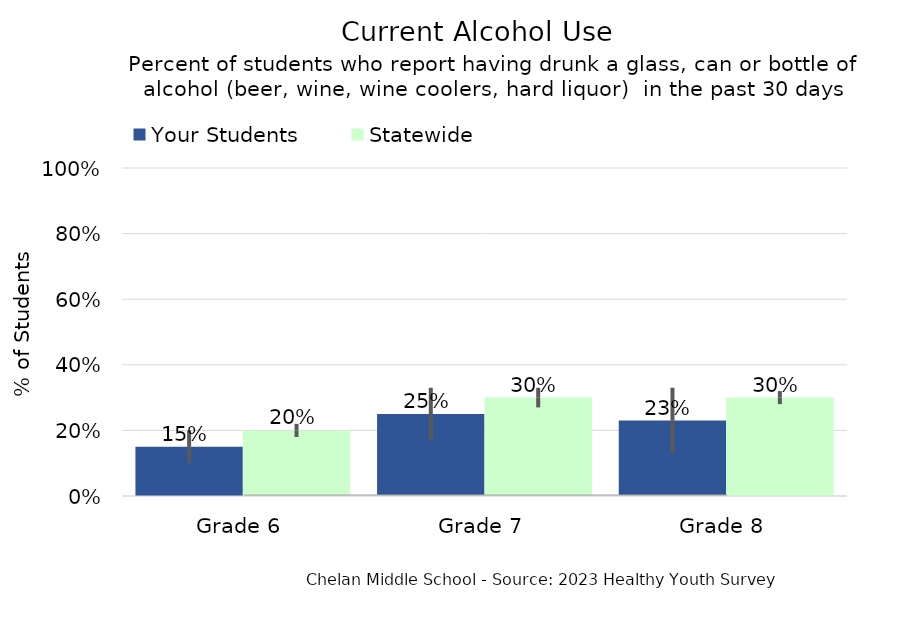
| Category | Your Students | Statewide |
|---|---|---|
| Grade 6 | 0.15 | 0.2 |
| Grade 7 | 0.25 | 0.3 |
| Grade 8 | 0.23 | 0.3 |